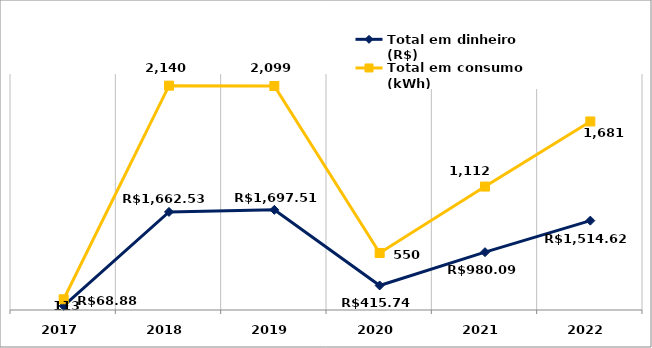
| Category | Total em dinheiro (R$) | Total em consumo (kWh) |
|---|---|---|
| 2017.0 | 68.88 | 113 |
| 2018.0 | 1662.53 | 2140 |
| 2019.0 | 1697.51 | 2099 |
| 2020.0 | 415.74 | 550 |
| 2021.0 | 980.09 | 1112 |
| 2022.0 | 1514.62 | 1681 |